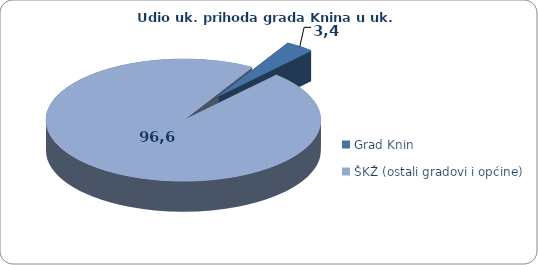
| Category | Ukupni prihod | Udio |
|---|---|---|
| Grad Knin | 234433.823 | 3.384 |
| ŠKŽ (ostali gradovi i općine) | 6693718.697 | 96.616 |